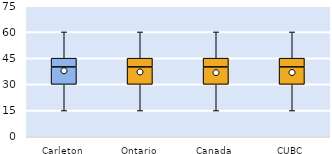
| Category | 25th | 50th | 75th |
|---|---|---|---|
| Carleton | 30 | 10 | 5 |
| Ontario | 30 | 10 | 5 |
| Canada | 30 | 10 | 5 |
| CUBC | 30 | 10 | 5 |